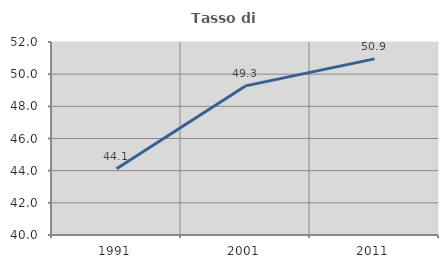
| Category | Tasso di occupazione   |
|---|---|
| 1991.0 | 44.123 |
| 2001.0 | 49.27 |
| 2011.0 | 50.95 |